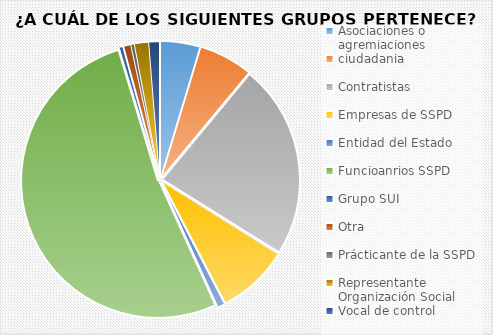
| Category | totales |
|---|---|
| Asociaciones o agremiaciones | 11 |
| ciudadania | 15 |
| Contratistas | 54 |
| Empresas de SSPD | 20 |
| Entidad del Estado  | 2 |
| Funcioanrios SSPD | 123 |
| Grupo SUI | 1 |
| Otra | 2 |
| Prácticante de la SSPD | 1 |
| Representante Organización Social | 4 |
| Vocal de control  | 3 |